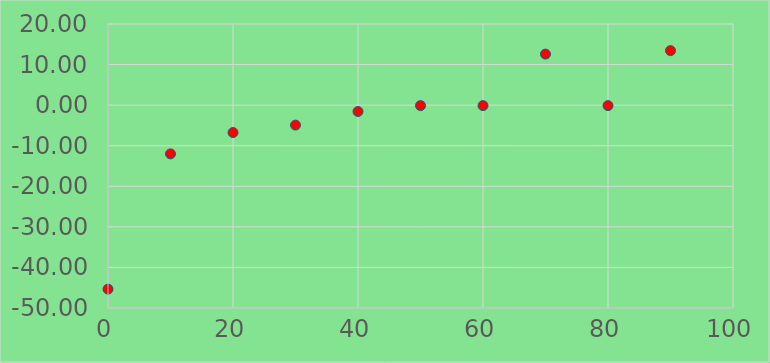
| Category | Series 0 |
|---|---|
| 0.0 | -45.349 |
| 10.0 | -12.016 |
| 20.0 | -6.749 |
| 30.0 | -4.918 |
| 40.0 | -1.568 |
| 50.0 | -0.118 |
| 60.0 | -0.118 |
| 70.0 | 12.582 |
| 80.0 | -0.118 |
| 90.0 | 13.432 |